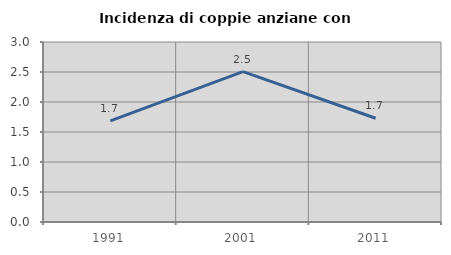
| Category | Incidenza di coppie anziane con figli |
|---|---|
| 1991.0 | 1.686 |
| 2001.0 | 2.507 |
| 2011.0 | 1.729 |